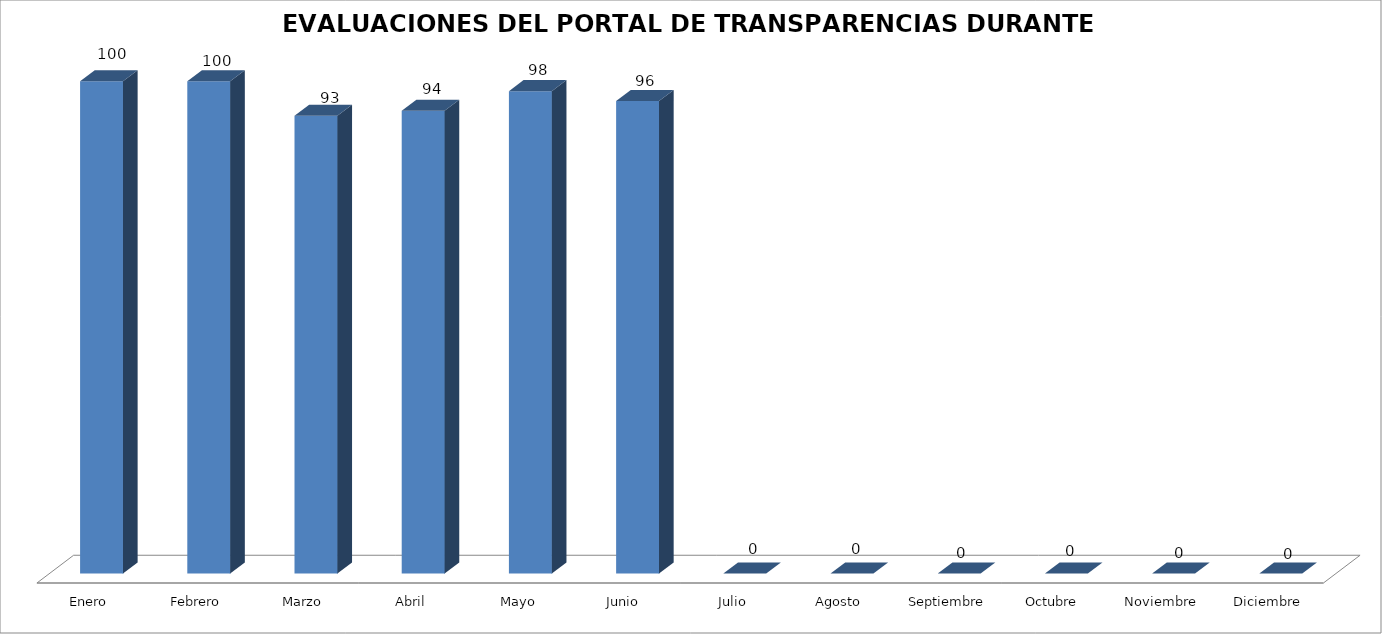
| Category | Series 0 |
|---|---|
| Enero | 100 |
| Febrero | 100 |
| Marzo | 93 |
| Abril | 94 |
| Mayo | 98 |
| Junio  | 96 |
| Julio | 0 |
| Agosto | 0 |
| Septiembre | 0 |
| Octubre  | 0 |
| Noviembre | 0 |
| Diciembre | 0 |